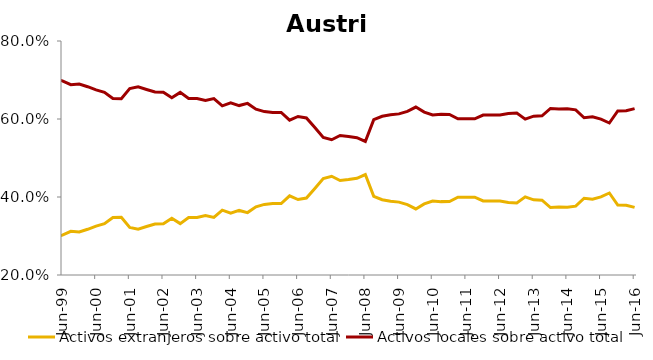
| Category | Activos extranjeros sobre activo total | Activos locales sobre activo total |
|---|---|---|
| 1999-03-01 | 0.297 | 0.703 |
| 1999-06-01 | 0.302 | 0.698 |
| 1999-09-01 | 0.312 | 0.688 |
| 1999-12-01 | 0.31 | 0.69 |
| 2000-03-01 | 0.317 | 0.683 |
| 2000-06-01 | 0.325 | 0.675 |
| 2000-09-01 | 0.332 | 0.668 |
| 2000-12-01 | 0.347 | 0.653 |
| 2001-03-01 | 0.348 | 0.652 |
| 2001-06-01 | 0.322 | 0.678 |
| 2001-09-01 | 0.318 | 0.682 |
| 2001-12-01 | 0.324 | 0.676 |
| 2002-03-01 | 0.331 | 0.669 |
| 2002-06-01 | 0.331 | 0.669 |
| 2002-09-01 | 0.346 | 0.654 |
| 2002-12-01 | 0.332 | 0.668 |
| 2003-03-01 | 0.348 | 0.652 |
| 2003-06-01 | 0.348 | 0.652 |
| 2003-09-01 | 0.352 | 0.648 |
| 2003-12-01 | 0.347 | 0.653 |
| 2004-03-01 | 0.366 | 0.634 |
| 2004-06-01 | 0.359 | 0.641 |
| 2004-09-01 | 0.366 | 0.634 |
| 2004-12-01 | 0.36 | 0.64 |
| 2005-03-01 | 0.375 | 0.625 |
| 2005-06-01 | 0.381 | 0.619 |
| 2005-09-01 | 0.383 | 0.617 |
| 2005-12-01 | 0.383 | 0.617 |
| 2006-03-01 | 0.403 | 0.597 |
| 2006-06-01 | 0.394 | 0.606 |
| 2006-09-01 | 0.397 | 0.603 |
| 2006-12-01 | 0.422 | 0.578 |
| 2007-03-01 | 0.447 | 0.553 |
| 2007-06-01 | 0.453 | 0.547 |
| 2007-09-01 | 0.442 | 0.558 |
| 2007-12-01 | 0.445 | 0.555 |
| 2008-03-01 | 0.448 | 0.552 |
| 2008-06-01 | 0.458 | 0.542 |
| 2008-09-01 | 0.402 | 0.598 |
| 2008-12-01 | 0.393 | 0.607 |
| 2009-03-01 | 0.389 | 0.611 |
| 2009-06-01 | 0.387 | 0.613 |
| 2009-09-01 | 0.38 | 0.62 |
| 2009-12-01 | 0.369 | 0.631 |
| 2010-03-01 | 0.382 | 0.618 |
| 2010-06-01 | 0.39 | 0.61 |
| 2010-09-01 | 0.388 | 0.612 |
| 2010-12-01 | 0.388 | 0.612 |
| 2011-03-01 | 0.399 | 0.601 |
| 2011-06-01 | 0.399 | 0.601 |
| 2011-09-01 | 0.399 | 0.601 |
| 2011-12-01 | 0.39 | 0.61 |
| 2012-03-01 | 0.39 | 0.61 |
| 2012-06-01 | 0.39 | 0.61 |
| 2012-09-01 | 0.386 | 0.614 |
| 2012-12-01 | 0.385 | 0.615 |
| 2013-03-01 | 0.4 | 0.6 |
| 2013-06-01 | 0.393 | 0.607 |
| 2013-09-01 | 0.392 | 0.608 |
| 2013-12-01 | 0.373 | 0.627 |
| 2014-03-01 | 0.374 | 0.626 |
| 2014-06-01 | 0.374 | 0.626 |
| 2014-09-01 | 0.377 | 0.623 |
| 2014-12-01 | 0.397 | 0.603 |
| 2015-03-01 | 0.394 | 0.606 |
| 2015-06-01 | 0.4 | 0.6 |
| 2015-09-01 | 0.41 | 0.59 |
| 2015-12-01 | 0.379 | 0.621 |
| 2016-03-01 | 0.379 | 0.621 |
| 2016-06-01 | 0.373 | 0.627 |